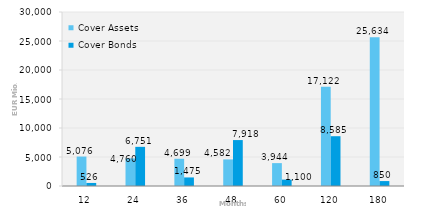
| Category | Cover Assets | Cover Bonds |
|---|---|---|
| 12.0 | 5075.933 | 525.723 |
| 24.0 | 4760.127 | 6750.5 |
| 36.0 | 4699.378 | 1475 |
| 48.0 | 4582.205 | 7917.592 |
| 60.0 | 3944.232 | 1100 |
| 120.0 | 17121.875 | 8584.756 |
| 180.0 | 25633.997 | 850 |